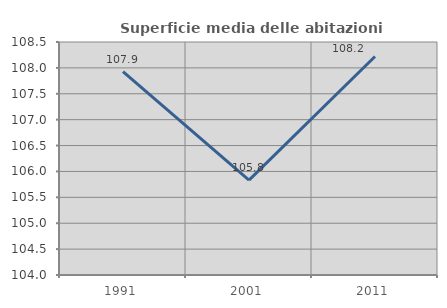
| Category | Superficie media delle abitazioni occupate |
|---|---|
| 1991.0 | 107.93 |
| 2001.0 | 105.832 |
| 2011.0 | 108.221 |